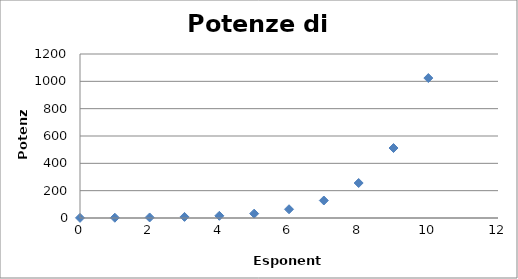
| Category | Potenza |
|---|---|
| 0.0 | 1 |
| 1.0 | 2 |
| 2.0 | 4 |
| 3.0 | 8 |
| 4.0 | 16 |
| 5.0 | 32 |
| 6.0 | 64 |
| 7.0 | 128 |
| 8.0 | 256 |
| 9.0 | 512 |
| 10.0 | 1024 |